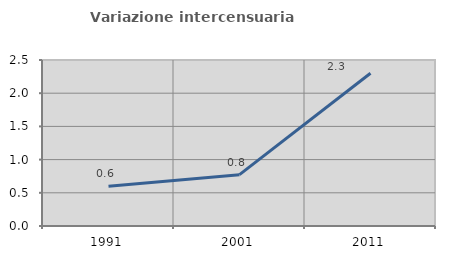
| Category | Variazione intercensuaria annua |
|---|---|
| 1991.0 | 0.6 |
| 2001.0 | 0.773 |
| 2011.0 | 2.301 |